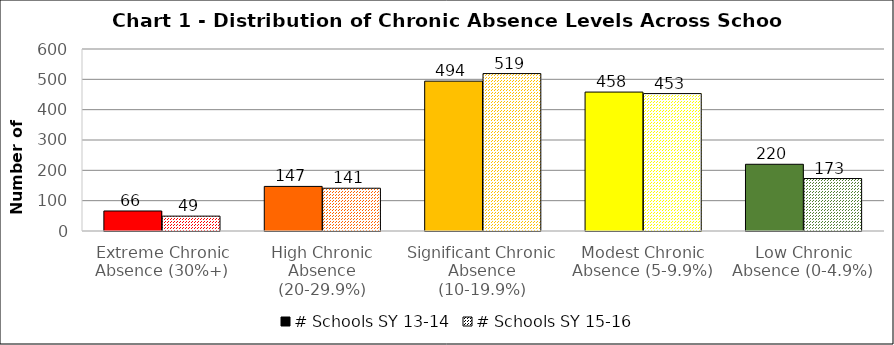
| Category | # Schools SY 13-14 | # Schools SY 15-16 |
|---|---|---|
| Extreme Chronic Absence (30%+) | 66 | 49 |
| High Chronic Absence (20-29.9%) | 147 | 141 |
| Significant Chronic Absence (10-19.9%) | 494 | 519 |
| Modest Chronic Absence (5-9.9%) | 458 | 453 |
| Low Chronic Absence (0-4.9%) | 220 | 173 |